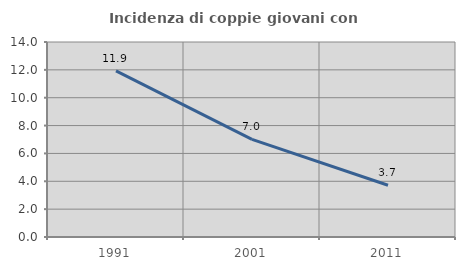
| Category | Incidenza di coppie giovani con figli |
|---|---|
| 1991.0 | 11.923 |
| 2001.0 | 7.004 |
| 2011.0 | 3.717 |